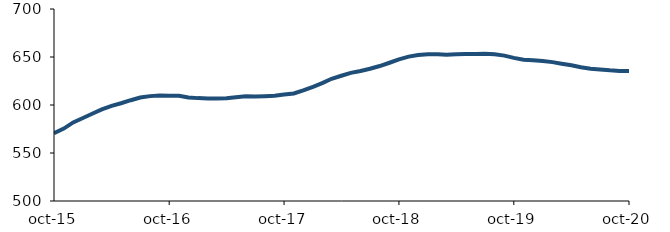
| Category | Series 0 |
|---|---|
| 2015-10-01 | 570.667 |
| 2015-11-01 | 575.417 |
| 2015-12-01 | 581.833 |
| 2016-01-01 | 586.417 |
| 2016-02-01 | 591.167 |
| 2016-03-01 | 595.5 |
| 2016-04-01 | 599.167 |
| 2016-05-01 | 601.833 |
| 2016-06-01 | 605 |
| 2016-07-01 | 607.75 |
| 2016-08-01 | 609.25 |
| 2016-09-01 | 609.917 |
| 2016-10-01 | 609.667 |
| 2016-11-01 | 609.583 |
| 2016-12-01 | 607.917 |
| 2017-01-01 | 607.167 |
| 2017-02-01 | 606.833 |
| 2017-03-01 | 606.667 |
| 2017-04-01 | 606.917 |
| 2017-05-01 | 608.083 |
| 2017-06-01 | 609.083 |
| 2017-07-01 | 608.833 |
| 2017-08-01 | 609.167 |
| 2017-09-01 | 609.667 |
| 2017-10-01 | 610.833 |
| 2017-11-01 | 612 |
| 2017-12-01 | 615.167 |
| 2018-01-01 | 619 |
| 2018-02-01 | 623.083 |
| 2018-03-01 | 627.333 |
| 2018-04-01 | 630.5 |
| 2018-05-01 | 633.5 |
| 2018-06-01 | 635.5 |
| 2018-07-01 | 637.75 |
| 2018-08-01 | 640.583 |
| 2018-09-01 | 644 |
| 2018-10-01 | 647.5 |
| 2018-11-01 | 650.417 |
| 2018-12-01 | 652.167 |
| 2019-01-01 | 652.917 |
| 2019-02-01 | 652.75 |
| 2019-03-01 | 652.417 |
| 2019-04-01 | 652.833 |
| 2019-05-01 | 653.167 |
| 2019-06-01 | 653.25 |
| 2019-07-01 | 653.5 |
| 2019-08-01 | 652.75 |
| 2019-09-01 | 651.417 |
| 2019-10-01 | 649.083 |
| 2019-11-01 | 647.167 |
| 2019-12-01 | 646.667 |
| 2020-01-01 | 645.917 |
| 2020-02-01 | 644.667 |
| 2020-03-01 | 643 |
| 2020-04-01 | 641.417 |
| 2020-05-01 | 639.25 |
| 2020-06-01 | 637.833 |
| 2020-07-01 | 637 |
| 2020-08-01 | 636.083 |
| 2020-09-01 | 635.417 |
| 2020-10-01 | 635.417 |